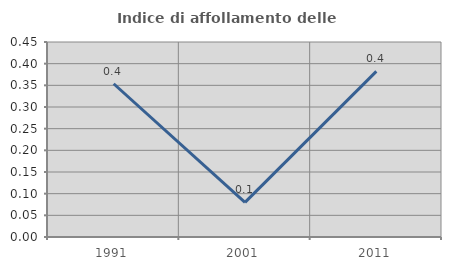
| Category | Indice di affollamento delle abitazioni  |
|---|---|
| 1991.0 | 0.354 |
| 2001.0 | 0.08 |
| 2011.0 | 0.382 |